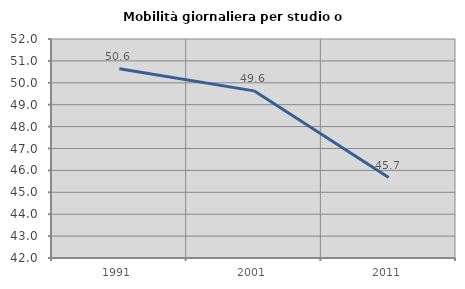
| Category | Mobilità giornaliera per studio o lavoro |
|---|---|
| 1991.0 | 50.637 |
| 2001.0 | 49.632 |
| 2011.0 | 45.674 |